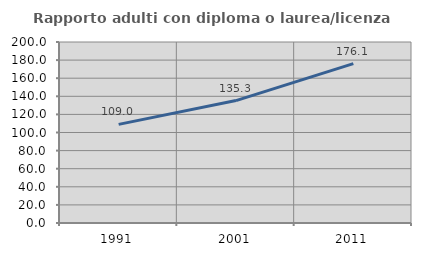
| Category | Rapporto adulti con diploma o laurea/licenza media  |
|---|---|
| 1991.0 | 109 |
| 2001.0 | 135.26 |
| 2011.0 | 176.143 |